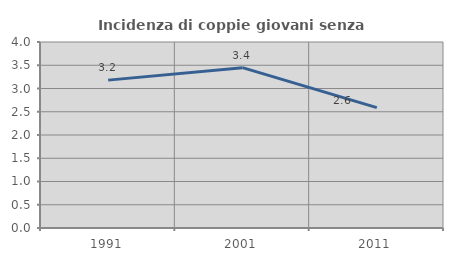
| Category | Incidenza di coppie giovani senza figli |
|---|---|
| 1991.0 | 3.18 |
| 2001.0 | 3.448 |
| 2011.0 | 2.589 |